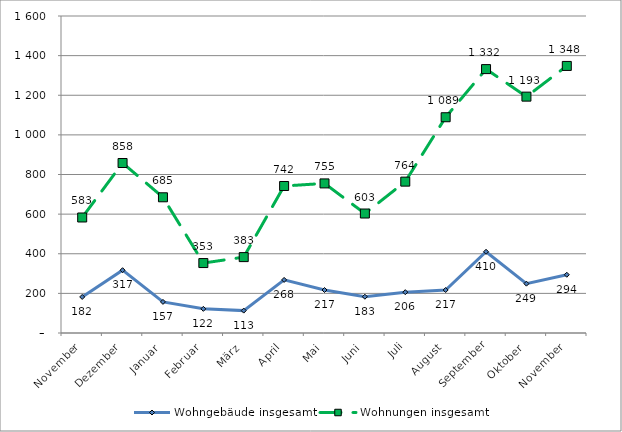
| Category | Wohngebäude insgesamt | Wohnungen insgesamt |
|---|---|---|
| November | 182 | 583 |
| Dezember | 317 | 858 |
| Januar | 157 | 685 |
| Februar | 122 | 353 |
| März | 113 | 383 |
| April | 268 | 742 |
| Mai | 217 | 755 |
| Juni | 183 | 603 |
| Juli | 206 | 764 |
| August | 217 | 1089 |
| September | 410 | 1332 |
| Oktober | 249 | 1193 |
| November | 294 | 1348 |